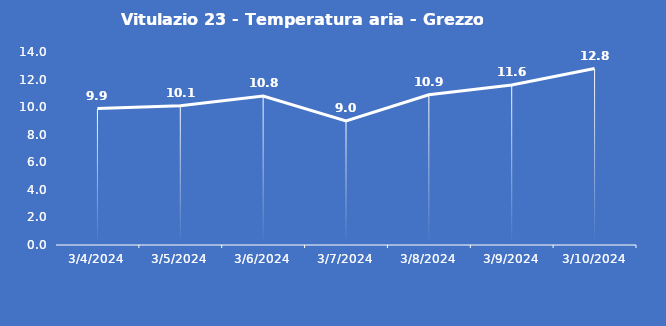
| Category | Vitulazio 23 - Temperatura aria - Grezzo (°C) |
|---|---|
| 3/4/24 | 9.9 |
| 3/5/24 | 10.1 |
| 3/6/24 | 10.8 |
| 3/7/24 | 9 |
| 3/8/24 | 10.9 |
| 3/9/24 | 11.6 |
| 3/10/24 | 12.8 |